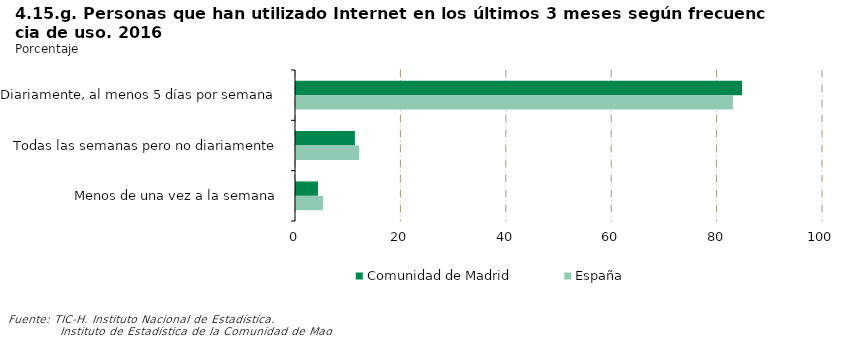
| Category | Comunidad de Madrid | España |
|---|---|---|
| Diariamente, al menos 5 días por semana | 84.649 | 82.907 |
| Todas las semanas pero no diariamente | 11.178 | 11.99 |
| Menos de una vez a la semana | 4.173 | 5.103 |